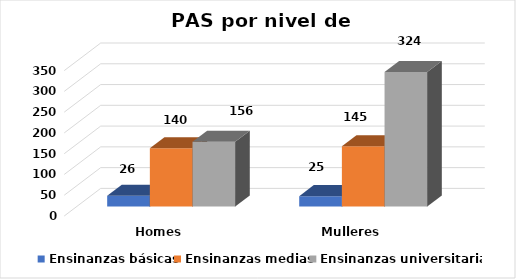
| Category | Ensinanzas básicas | Ensinanzas medias | Ensinanzas universitarias |
|---|---|---|---|
| Homes | 26 | 140 | 156 |
| Mulleres | 25 | 145 | 324 |